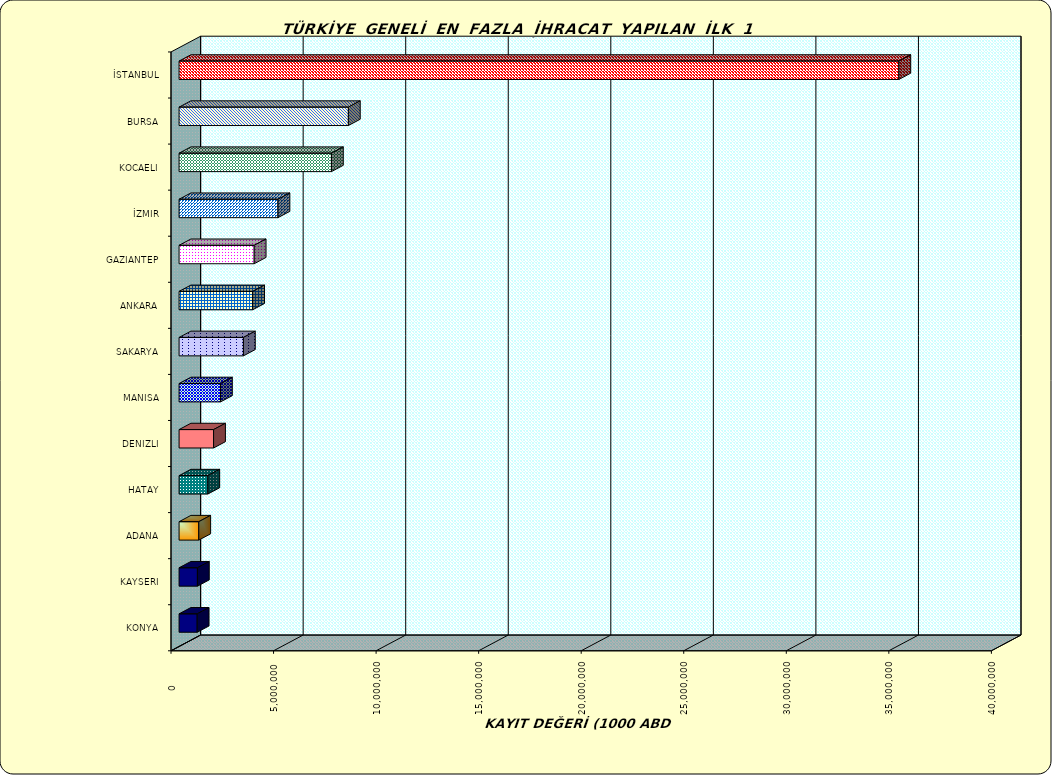
| Category | Series 0 |
|---|---|
| İSTANBUL | 35095250.162 |
| BURSA | 8254886.992 |
| KOCAELI | 7429377.764 |
| İZMIR | 4822069.316 |
| GAZIANTEP | 3662492.129 |
| ANKARA | 3587545.436 |
| SAKARYA | 3137506.759 |
| MANISA | 2018675.685 |
| DENIZLI | 1681649.301 |
| HATAY | 1401502.594 |
| ADANA | 960584.223 |
| KAYSERI | 893840.26 |
| KONYA | 882979.791 |